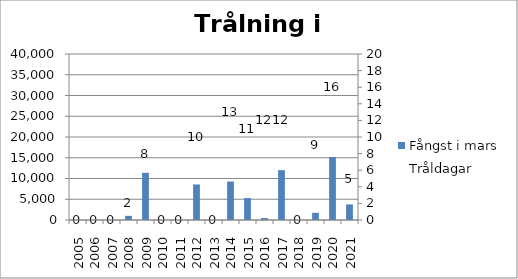
| Category | Fångst i mars |
|---|---|
| 2005.0 | 0 |
| 2006.0 | 0 |
| 2007.0 | 0 |
| 2008.0 | 1000 |
| 2009.0 | 11365 |
| 2010.0 | 0 |
| 2011.0 | 0 |
| 2012.0 | 8560 |
| 2013.0 | 0 |
| 2014.0 | 9280 |
| 2015.0 | 5294 |
| 2016.0 | 470 |
| 2017.0 | 12010 |
| 2018.0 | 0 |
| 2019.0 | 1732 |
| 2020.0 | 15170 |
| 2021.0 | 3750 |